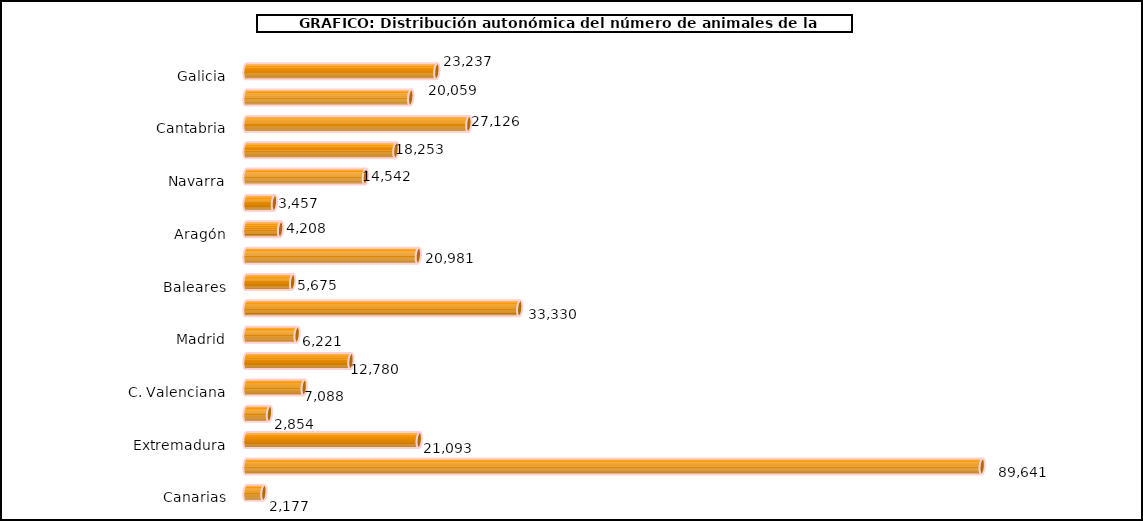
| Category | num. Animales |
|---|---|
|   Galicia | 23237 |
|   P. de Asturias | 20059 |
|   Cantabria | 27126 |
|   País Vasco | 18253 |
|   Navarra | 14542 |
|   La Rioja | 3457 |
|   Aragón | 4208 |
|   Cataluña | 20981 |
|   Baleares | 5675 |
|   Castilla y León | 33330 |
|   Madrid | 6221 |
|   Castilla – La Mancha | 12780 |
|   C. Valenciana | 7088 |
|   R. de Murcia | 2854 |
|   Extremadura | 21093 |
|   Andalucía | 89641 |
|   Canarias | 2177 |